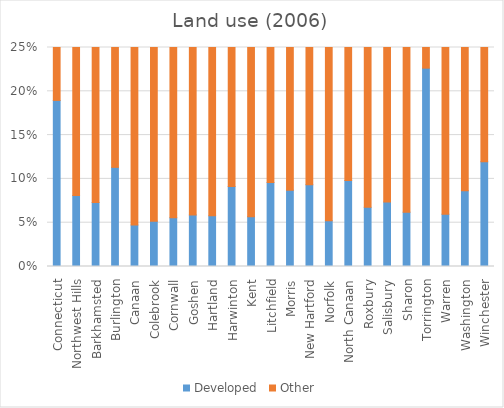
| Category | Developed | Other |
|---|---|---|
| Connecticut | 942.1 | 4026.9 |
| Northwest Hills | 41915 | 475176 |
| Barkhamsted | 1811 | 22964 |
| Burlington | 2207 | 17292 |
| Canaan | 1003 | 20209 |
| Colebrook | 1090 | 19957 |
| Cornwall | 1656 | 28061 |
| Goshen | 1704 | 27232 |
| Hartland | 1268 | 20667 |
| Harwinton | 1819 | 18088 |
| Kent | 1809 | 29999 |
| Litchfield | 3497 | 32938 |
| Morris | 1043 | 10920 |
| New Hartford | 2276 | 22087 |
| Norfolk | 1548 | 28116 |
| North Canaan | 1226 | 11269 |
| Roxbury | 1136 | 15687 |
| Salisbury | 2834 | 35677 |
| Sharon | 2369 | 35840 |
| Torrington | 5840 | 19953 |
| Warren | 1050 | 16547 |
| Washington | 2140 | 22588 |
| Winchester | 2589 | 19085 |